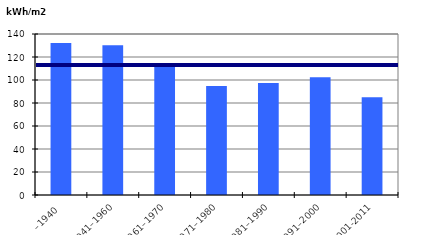
| Category | Byggårskategori |
|---|---|
| –1940 | 132.126 |
| 1941–1960 | 130.168 |
| 1961–1970 | 112.33 |
| 1971–1980 | 94.743 |
| 1981–1990 | 97.482 |
| 1991–2000 | 102.444 |
| 2001-2011 | 85.066 |